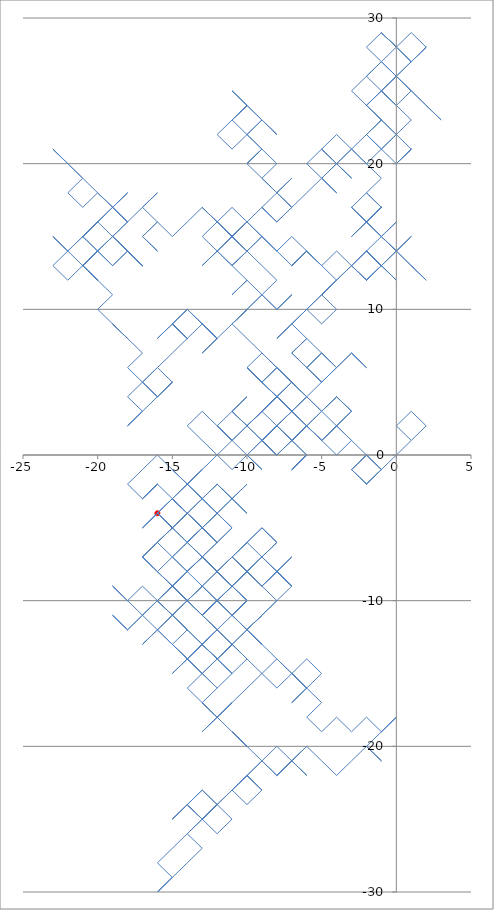
| Category | Series 0 |
|---|---|
| 1.0 | 1 |
| 0.0 | 2 |
| 1.0 | 3 |
| 2.0 | 2 |
| 1.0 | 1 |
| 0.0 | 0 |
| -1.0 | -1 |
| -2.0 | -2 |
| -1.0 | -1 |
| -2.0 | 0 |
| -1.0 | -1 |
| -2.0 | -2 |
| -3.0 | -1 |
| -2.0 | 0 |
| -3.0 | -1 |
| -2.0 | -2 |
| -3.0 | -1 |
| -2.0 | 0 |
| -3.0 | 1 |
| -4.0 | 2 |
| -5.0 | 1 |
| -4.0 | 2 |
| -3.0 | 3 |
| -4.0 | 4 |
| -3.0 | 3 |
| -4.0 | 2 |
| -5.0 | 3 |
| -4.0 | 4 |
| -5.0 | 3 |
| -6.0 | 2 |
| -7.0 | 3 |
| -8.0 | 4 |
| -9.0 | 3 |
| -10.0 | 2 |
| -9.0 | 3 |
| -8.0 | 4 |
| -9.0 | 5 |
| -8.0 | 4 |
| -9.0 | 3 |
| -8.0 | 2 |
| -9.0 | 1 |
| -8.0 | 0 |
| -7.0 | 1 |
| -6.0 | 0 |
| -7.0 | -1 |
| -6.0 | 0 |
| -7.0 | -1 |
| -6.0 | 0 |
| -7.0 | 1 |
| -8.0 | 0 |
| -9.0 | 1 |
| -8.0 | 2 |
| -7.0 | 1 |
| -6.0 | 2 |
| -5.0 | 1 |
| -6.0 | 2 |
| -7.0 | 1 |
| -6.0 | 2 |
| -5.0 | 1 |
| -4.0 | 2 |
| -5.0 | 1 |
| -6.0 | 2 |
| -7.0 | 3 |
| -8.0 | 4 |
| -9.0 | 5 |
| -10.0 | 6 |
| -9.0 | 5 |
| -8.0 | 4 |
| -7.0 | 3 |
| -8.0 | 2 |
| -7.0 | 1 |
| -6.0 | 2 |
| -7.0 | 3 |
| -8.0 | 4 |
| -9.0 | 3 |
| -10.0 | 2 |
| -9.0 | 3 |
| -8.0 | 4 |
| -7.0 | 3 |
| -8.0 | 4 |
| -7.0 | 3 |
| -8.0 | 2 |
| -7.0 | 1 |
| -8.0 | 2 |
| -9.0 | 1 |
| -8.0 | 0 |
| -9.0 | 1 |
| -10.0 | 0 |
| -9.0 | -1 |
| -10.0 | 0 |
| -11.0 | 1 |
| -12.0 | 2 |
| -11.0 | 1 |
| -12.0 | 2 |
| -13.0 | 3 |
| -14.0 | 2 |
| -13.0 | 1 |
| -12.0 | 0 |
| -11.0 | 1 |
| -10.0 | 2 |
| -11.0 | 3 |
| -10.0 | 2 |
| -11.0 | 3 |
| -10.0 | 4 |
| -11.0 | 3 |
| -12.0 | 2 |
| -11.0 | 1 |
| -10.0 | 2 |
| -9.0 | 1 |
| -8.0 | 0 |
| -9.0 | 1 |
| -10.0 | 2 |
| -9.0 | 3 |
| -8.0 | 4 |
| -7.0 | 3 |
| -6.0 | 4 |
| -7.0 | 5 |
| -8.0 | 6 |
| -9.0 | 5 |
| -8.0 | 4 |
| -7.0 | 5 |
| -8.0 | 6 |
| -9.0 | 5 |
| -10.0 | 6 |
| -9.0 | 5 |
| -10.0 | 6 |
| -9.0 | 7 |
| -8.0 | 6 |
| -7.0 | 5 |
| -8.0 | 4 |
| -7.0 | 3 |
| -8.0 | 2 |
| -9.0 | 1 |
| -8.0 | 2 |
| -7.0 | 3 |
| -6.0 | 4 |
| -7.0 | 5 |
| -6.0 | 4 |
| -7.0 | 3 |
| -6.0 | 2 |
| -7.0 | 1 |
| -6.0 | 2 |
| -5.0 | 3 |
| -6.0 | 4 |
| -7.0 | 5 |
| -8.0 | 6 |
| -9.0 | 5 |
| -8.0 | 4 |
| -7.0 | 5 |
| -8.0 | 6 |
| -9.0 | 7 |
| -10.0 | 8 |
| -11.0 | 9 |
| -10.0 | 10 |
| -11.0 | 9 |
| -10.0 | 10 |
| -11.0 | 9 |
| -10.0 | 10 |
| -9.0 | 11 |
| -8.0 | 12 |
| -9.0 | 13 |
| -10.0 | 14 |
| -9.0 | 15 |
| -10.0 | 16 |
| -11.0 | 17 |
| -12.0 | 16 |
| -11.0 | 15 |
| -12.0 | 16 |
| -13.0 | 17 |
| -14.0 | 16 |
| -15.0 | 15 |
| -16.0 | 16 |
| -17.0 | 15 |
| -16.0 | 14 |
| -17.0 | 15 |
| -16.0 | 16 |
| -17.0 | 17 |
| -16.0 | 18 |
| -17.0 | 17 |
| -18.0 | 16 |
| -19.0 | 17 |
| -20.0 | 18 |
| -21.0 | 17 |
| -22.0 | 18 |
| -21.0 | 19 |
| -22.0 | 20 |
| -23.0 | 21 |
| -22.0 | 20 |
| -21.0 | 19 |
| -20.0 | 18 |
| -19.0 | 17 |
| -20.0 | 16 |
| -21.0 | 15 |
| -20.0 | 14 |
| -21.0 | 13 |
| -20.0 | 14 |
| -21.0 | 13 |
| -20.0 | 12 |
| -21.0 | 13 |
| -20.0 | 12 |
| -21.0 | 13 |
| -20.0 | 14 |
| -19.0 | 15 |
| -18.0 | 16 |
| -19.0 | 17 |
| -18.0 | 16 |
| -19.0 | 15 |
| -18.0 | 14 |
| -19.0 | 15 |
| -18.0 | 14 |
| -17.0 | 13 |
| -18.0 | 14 |
| -19.0 | 13 |
| -20.0 | 14 |
| -21.0 | 15 |
| -20.0 | 16 |
| -19.0 | 17 |
| -18.0 | 18 |
| -19.0 | 17 |
| -20.0 | 18 |
| -19.0 | 17 |
| -20.0 | 16 |
| -21.0 | 15 |
| -20.0 | 16 |
| -21.0 | 15 |
| -20.0 | 16 |
| -19.0 | 15 |
| -18.0 | 14 |
| -17.0 | 13 |
| -18.0 | 14 |
| -17.0 | 13 |
| -18.0 | 14 |
| -19.0 | 15 |
| -18.0 | 14 |
| -19.0 | 13 |
| -20.0 | 14 |
| -19.0 | 15 |
| -20.0 | 14 |
| -21.0 | 13 |
| -22.0 | 12 |
| -23.0 | 13 |
| -22.0 | 14 |
| -23.0 | 15 |
| -22.0 | 14 |
| -21.0 | 15 |
| -20.0 | 16 |
| -21.0 | 15 |
| -22.0 | 14 |
| -21.0 | 13 |
| -20.0 | 12 |
| -19.0 | 11 |
| -20.0 | 10 |
| -19.0 | 9 |
| -18.0 | 8 |
| -19.0 | 9 |
| -18.0 | 8 |
| -17.0 | 7 |
| -18.0 | 6 |
| -17.0 | 5 |
| -18.0 | 4 |
| -17.0 | 3 |
| -18.0 | 2 |
| -17.0 | 3 |
| -16.0 | 4 |
| -15.0 | 5 |
| -16.0 | 4 |
| -15.0 | 5 |
| -16.0 | 6 |
| -17.0 | 5 |
| -16.0 | 4 |
| -17.0 | 5 |
| -16.0 | 6 |
| -15.0 | 7 |
| -14.0 | 8 |
| -15.0 | 9 |
| -14.0 | 8 |
| -15.0 | 9 |
| -16.0 | 8 |
| -15.0 | 9 |
| -14.0 | 10 |
| -15.0 | 9 |
| -14.0 | 8 |
| -13.0 | 9 |
| -14.0 | 10 |
| -13.0 | 9 |
| -12.0 | 8 |
| -13.0 | 9 |
| -12.0 | 8 |
| -13.0 | 7 |
| -12.0 | 8 |
| -11.0 | 9 |
| -10.0 | 10 |
| -9.0 | 11 |
| -8.0 | 10 |
| -7.0 | 11 |
| -8.0 | 10 |
| -9.0 | 11 |
| -10.0 | 12 |
| -11.0 | 11 |
| -10.0 | 12 |
| -11.0 | 13 |
| -10.0 | 14 |
| -11.0 | 13 |
| -12.0 | 14 |
| -13.0 | 13 |
| -12.0 | 14 |
| -11.0 | 15 |
| -10.0 | 16 |
| -11.0 | 15 |
| -12.0 | 16 |
| -13.0 | 17 |
| -12.0 | 16 |
| -11.0 | 15 |
| -12.0 | 14 |
| -11.0 | 15 |
| -10.0 | 16 |
| -11.0 | 15 |
| -12.0 | 16 |
| -13.0 | 15 |
| -12.0 | 14 |
| -11.0 | 13 |
| -10.0 | 14 |
| -11.0 | 15 |
| -10.0 | 14 |
| -11.0 | 15 |
| -10.0 | 14 |
| -9.0 | 15 |
| -10.0 | 16 |
| -9.0 | 17 |
| -8.0 | 18 |
| -7.0 | 17 |
| -8.0 | 16 |
| -9.0 | 17 |
| -8.0 | 16 |
| -7.0 | 17 |
| -8.0 | 18 |
| -9.0 | 19 |
| -8.0 | 20 |
| -9.0 | 21 |
| -10.0 | 22 |
| -9.0 | 23 |
| -10.0 | 24 |
| -11.0 | 23 |
| -10.0 | 24 |
| -11.0 | 23 |
| -10.0 | 22 |
| -11.0 | 21 |
| -12.0 | 22 |
| -11.0 | 23 |
| -10.0 | 24 |
| -11.0 | 25 |
| -10.0 | 24 |
| -9.0 | 23 |
| -8.0 | 22 |
| -9.0 | 23 |
| -10.0 | 22 |
| -9.0 | 21 |
| -10.0 | 20 |
| -9.0 | 21 |
| -10.0 | 20 |
| -9.0 | 19 |
| -8.0 | 18 |
| -7.0 | 19 |
| -8.0 | 18 |
| -7.0 | 17 |
| -6.0 | 18 |
| -5.0 | 19 |
| -4.0 | 20 |
| -3.0 | 21 |
| -2.0 | 22 |
| -1.0 | 23 |
| 0.0 | 22 |
| 1.0 | 21 |
| 0.0 | 20 |
| 1.0 | 21 |
| 0.0 | 20 |
| -1.0 | 21 |
| 0.0 | 22 |
| 1.0 | 23 |
| 0.0 | 24 |
| -1.0 | 25 |
| 0.0 | 26 |
| 1.0 | 25 |
| 0.0 | 24 |
| -1.0 | 25 |
| 0.0 | 26 |
| 1.0 | 25 |
| 2.0 | 24 |
| 3.0 | 23 |
| 2.0 | 24 |
| 1.0 | 25 |
| 0.0 | 26 |
| -1.0 | 27 |
| -2.0 | 28 |
| -1.0 | 29 |
| 0.0 | 28 |
| -1.0 | 29 |
| 0.0 | 28 |
| -1.0 | 29 |
| 0.0 | 28 |
| 1.0 | 27 |
| 2.0 | 28 |
| 1.0 | 29 |
| 0.0 | 28 |
| 1.0 | 27 |
| 0.0 | 26 |
| -1.0 | 25 |
| -2.0 | 24 |
| -1.0 | 25 |
| 0.0 | 24 |
| -1.0 | 25 |
| -2.0 | 26 |
| -1.0 | 27 |
| 0.0 | 28 |
| 1.0 | 27 |
| 2.0 | 28 |
| 1.0 | 27 |
| 0.0 | 26 |
| -1.0 | 27 |
| -2.0 | 26 |
| -3.0 | 25 |
| -2.0 | 24 |
| -1.0 | 23 |
| -2.0 | 22 |
| -1.0 | 21 |
| 0.0 | 22 |
| -1.0 | 23 |
| -2.0 | 24 |
| -1.0 | 23 |
| -2.0 | 22 |
| -1.0 | 21 |
| -2.0 | 20 |
| -3.0 | 21 |
| -4.0 | 20 |
| -5.0 | 21 |
| -4.0 | 20 |
| -3.0 | 19 |
| -4.0 | 20 |
| -5.0 | 19 |
| -4.0 | 18 |
| -5.0 | 19 |
| -6.0 | 20 |
| -5.0 | 21 |
| -4.0 | 22 |
| -3.0 | 21 |
| -2.0 | 20 |
| -1.0 | 19 |
| -2.0 | 18 |
| -1.0 | 17 |
| -2.0 | 16 |
| -3.0 | 15 |
| -2.0 | 16 |
| -3.0 | 17 |
| -2.0 | 16 |
| -1.0 | 17 |
| -2.0 | 18 |
| -3.0 | 17 |
| -2.0 | 16 |
| -1.0 | 15 |
| -2.0 | 16 |
| -1.0 | 17 |
| -2.0 | 16 |
| -1.0 | 17 |
| -2.0 | 16 |
| -1.0 | 15 |
| -2.0 | 14 |
| -3.0 | 13 |
| -4.0 | 12 |
| -3.0 | 13 |
| -2.0 | 12 |
| -1.0 | 13 |
| 0.0 | 14 |
| 1.0 | 13 |
| 2.0 | 12 |
| 1.0 | 13 |
| 0.0 | 14 |
| -1.0 | 15 |
| 0.0 | 14 |
| -1.0 | 15 |
| 0.0 | 16 |
| -1.0 | 15 |
| 0.0 | 14 |
| 1.0 | 15 |
| 0.0 | 14 |
| -1.0 | 13 |
| -2.0 | 14 |
| -1.0 | 13 |
| -2.0 | 14 |
| -1.0 | 13 |
| -2.0 | 12 |
| -1.0 | 13 |
| 0.0 | 12 |
| -1.0 | 13 |
| -2.0 | 12 |
| -3.0 | 13 |
| -2.0 | 12 |
| -3.0 | 13 |
| -2.0 | 14 |
| -1.0 | 13 |
| -2.0 | 14 |
| -3.0 | 13 |
| -4.0 | 14 |
| -5.0 | 13 |
| -6.0 | 14 |
| -5.0 | 13 |
| -6.0 | 14 |
| -7.0 | 15 |
| -8.0 | 14 |
| -9.0 | 15 |
| -8.0 | 14 |
| -7.0 | 13 |
| -6.0 | 14 |
| -7.0 | 13 |
| -6.0 | 14 |
| -5.0 | 13 |
| -4.0 | 12 |
| -5.0 | 11 |
| -4.0 | 12 |
| -5.0 | 11 |
| -6.0 | 10 |
| -7.0 | 9 |
| -8.0 | 8 |
| -7.0 | 9 |
| -6.0 | 10 |
| -5.0 | 11 |
| -4.0 | 10 |
| -5.0 | 9 |
| -6.0 | 10 |
| -7.0 | 9 |
| -6.0 | 8 |
| -5.0 | 7 |
| -6.0 | 6 |
| -7.0 | 7 |
| -6.0 | 8 |
| -7.0 | 7 |
| -6.0 | 6 |
| -5.0 | 7 |
| -4.0 | 6 |
| -5.0 | 7 |
| -6.0 | 6 |
| -5.0 | 5 |
| -4.0 | 6 |
| -3.0 | 7 |
| -2.0 | 6 |
| -3.0 | 7 |
| -4.0 | 6 |
| -5.0 | 5 |
| -6.0 | 6 |
| -5.0 | 5 |
| -6.0 | 4 |
| -5.0 | 3 |
| -4.0 | 4 |
| -3.0 | 3 |
| -4.0 | 2 |
| -3.0 | 1 |
| -4.0 | 0 |
| -5.0 | 1 |
| -6.0 | 2 |
| -7.0 | 1 |
| -6.0 | 2 |
| -7.0 | 1 |
| -8.0 | 0 |
| -9.0 | 1 |
| -10.0 | 0 |
| -11.0 | -1 |
| -12.0 | 0 |
| -13.0 | -1 |
| -14.0 | -2 |
| -15.0 | -3 |
| -16.0 | -4 |
| -15.0 | -3 |
| -14.0 | -4 |
| -15.0 | -5 |
| -14.0 | -4 |
| -15.0 | -3 |
| -14.0 | -4 |
| -15.0 | -3 |
| -16.0 | -2 |
| -17.0 | -3 |
| -16.0 | -2 |
| -17.0 | -3 |
| -18.0 | -2 |
| -17.0 | -1 |
| -16.0 | 0 |
| -15.0 | -1 |
| -14.0 | -2 |
| -13.0 | -3 |
| -12.0 | -4 |
| -11.0 | -3 |
| -10.0 | -4 |
| -11.0 | -3 |
| -12.0 | -2 |
| -11.0 | -3 |
| -10.0 | -2 |
| -11.0 | -3 |
| -12.0 | -4 |
| -11.0 | -5 |
| -12.0 | -6 |
| -13.0 | -5 |
| -14.0 | -6 |
| -13.0 | -5 |
| -14.0 | -4 |
| -13.0 | -5 |
| -12.0 | -6 |
| -13.0 | -7 |
| -14.0 | -8 |
| -15.0 | -9 |
| -14.0 | -10 |
| -13.0 | -11 |
| -14.0 | -10 |
| -13.0 | -9 |
| -14.0 | -10 |
| -15.0 | -11 |
| -16.0 | -12 |
| -17.0 | -13 |
| -16.0 | -12 |
| -15.0 | -11 |
| -14.0 | -10 |
| -13.0 | -9 |
| -14.0 | -8 |
| -15.0 | -7 |
| -14.0 | -6 |
| -13.0 | -7 |
| -12.0 | -8 |
| -11.0 | -7 |
| -10.0 | -8 |
| -9.0 | -7 |
| -8.0 | -8 |
| -7.0 | -9 |
| -8.0 | -8 |
| -9.0 | -9 |
| -8.0 | -8 |
| -7.0 | -9 |
| -8.0 | -10 |
| -9.0 | -11 |
| -10.0 | -12 |
| -9.0 | -13 |
| -8.0 | -14 |
| -7.0 | -15 |
| -6.0 | -14 |
| -5.0 | -15 |
| -6.0 | -16 |
| -7.0 | -15 |
| -8.0 | -14 |
| -9.0 | -15 |
| -10.0 | -14 |
| -11.0 | -13 |
| -12.0 | -14 |
| -11.0 | -13 |
| -12.0 | -14 |
| -13.0 | -13 |
| -12.0 | -12 |
| -13.0 | -13 |
| -14.0 | -14 |
| -13.0 | -13 |
| -14.0 | -12 |
| -15.0 | -11 |
| -14.0 | -12 |
| -15.0 | -11 |
| -16.0 | -12 |
| -15.0 | -13 |
| -14.0 | -12 |
| -13.0 | -13 |
| -12.0 | -14 |
| -13.0 | -15 |
| -14.0 | -14 |
| -15.0 | -15 |
| -14.0 | -14 |
| -13.0 | -13 |
| -12.0 | -14 |
| -13.0 | -13 |
| -12.0 | -14 |
| -13.0 | -15 |
| -12.0 | -16 |
| -13.0 | -17 |
| -12.0 | -18 |
| -11.0 | -17 |
| -12.0 | -18 |
| -13.0 | -17 |
| -12.0 | -18 |
| -11.0 | -17 |
| -10.0 | -16 |
| -9.0 | -15 |
| -8.0 | -16 |
| -7.0 | -15 |
| -6.0 | -16 |
| -7.0 | -17 |
| -6.0 | -16 |
| -7.0 | -15 |
| -6.0 | -16 |
| -5.0 | -17 |
| -6.0 | -18 |
| -5.0 | -19 |
| -4.0 | -18 |
| -3.0 | -19 |
| -2.0 | -18 |
| -1.0 | -19 |
| 0.0 | -18 |
| -1.0 | -19 |
| -2.0 | -20 |
| -1.0 | -21 |
| -2.0 | -20 |
| -3.0 | -21 |
| -4.0 | -22 |
| -5.0 | -21 |
| -6.0 | -20 |
| -7.0 | -21 |
| -8.0 | -20 |
| -9.0 | -21 |
| -10.0 | -22 |
| -9.0 | -23 |
| -10.0 | -24 |
| -11.0 | -23 |
| -10.0 | -22 |
| -11.0 | -23 |
| -12.0 | -24 |
| -13.0 | -25 |
| -12.0 | -26 |
| -11.0 | -25 |
| -12.0 | -24 |
| -13.0 | -23 |
| -14.0 | -24 |
| -15.0 | -25 |
| -14.0 | -24 |
| -13.0 | -25 |
| -14.0 | -26 |
| -13.0 | -27 |
| -14.0 | -28 |
| -15.0 | -29 |
| -16.0 | -30 |
| -15.0 | -29 |
| -16.0 | -28 |
| -15.0 | -27 |
| -14.0 | -26 |
| -13.0 | -25 |
| -12.0 | -24 |
| -13.0 | -25 |
| -14.0 | -24 |
| -13.0 | -25 |
| -12.0 | -24 |
| -13.0 | -25 |
| -14.0 | -24 |
| -13.0 | -23 |
| -12.0 | -24 |
| -11.0 | -23 |
| -10.0 | -22 |
| -9.0 | -23 |
| -10.0 | -22 |
| -9.0 | -21 |
| -8.0 | -22 |
| -7.0 | -21 |
| -6.0 | -22 |
| -7.0 | -21 |
| -8.0 | -22 |
| -7.0 | -21 |
| -6.0 | -20 |
| -7.0 | -21 |
| -8.0 | -22 |
| -9.0 | -21 |
| -10.0 | -20 |
| -11.0 | -19 |
| -10.0 | -20 |
| -11.0 | -19 |
| -12.0 | -18 |
| -13.0 | -19 |
| -12.0 | -18 |
| -13.0 | -17 |
| -14.0 | -16 |
| -13.0 | -15 |
| -14.0 | -14 |
| -13.0 | -15 |
| -12.0 | -16 |
| -11.0 | -15 |
| -10.0 | -14 |
| -11.0 | -13 |
| -12.0 | -14 |
| -13.0 | -13 |
| -12.0 | -14 |
| -11.0 | -15 |
| -12.0 | -14 |
| -11.0 | -13 |
| -12.0 | -12 |
| -13.0 | -11 |
| -12.0 | -10 |
| -11.0 | -9 |
| -10.0 | -10 |
| -11.0 | -11 |
| -10.0 | -10 |
| -11.0 | -9 |
| -10.0 | -10 |
| -11.0 | -9 |
| -12.0 | -8 |
| -13.0 | -7 |
| -14.0 | -6 |
| -13.0 | -5 |
| -14.0 | -6 |
| -15.0 | -5 |
| -16.0 | -6 |
| -15.0 | -5 |
| -16.0 | -6 |
| -17.0 | -7 |
| -16.0 | -6 |
| -15.0 | -7 |
| -14.0 | -8 |
| -13.0 | -7 |
| -14.0 | -8 |
| -15.0 | -9 |
| -16.0 | -10 |
| -15.0 | -9 |
| -14.0 | -8 |
| -13.0 | -7 |
| -12.0 | -8 |
| -11.0 | -9 |
| -12.0 | -8 |
| -11.0 | -9 |
| -12.0 | -10 |
| -13.0 | -11 |
| -12.0 | -12 |
| -11.0 | -13 |
| -12.0 | -14 |
| -11.0 | -13 |
| -10.0 | -12 |
| -9.0 | -11 |
| -10.0 | -12 |
| -9.0 | -11 |
| -10.0 | -12 |
| -11.0 | -11 |
| -12.0 | -10 |
| -13.0 | -11 |
| -12.0 | -10 |
| -11.0 | -9 |
| -12.0 | -10 |
| -11.0 | -11 |
| -10.0 | -12 |
| -9.0 | -13 |
| -10.0 | -12 |
| -11.0 | -11 |
| -12.0 | -10 |
| -13.0 | -11 |
| -12.0 | -12 |
| -13.0 | -13 |
| -14.0 | -14 |
| -15.0 | -13 |
| -14.0 | -14 |
| -15.0 | -13 |
| -16.0 | -12 |
| -17.0 | -11 |
| -18.0 | -12 |
| -19.0 | -11 |
| -18.0 | -12 |
| -17.0 | -11 |
| -18.0 | -10 |
| -19.0 | -9 |
| -18.0 | -10 |
| -17.0 | -9 |
| -16.0 | -10 |
| -17.0 | -11 |
| -16.0 | -10 |
| -15.0 | -11 |
| -16.0 | -10 |
| -15.0 | -11 |
| -14.0 | -10 |
| -15.0 | -9 |
| -16.0 | -8 |
| -15.0 | -9 |
| -14.0 | -10 |
| -15.0 | -9 |
| -14.0 | -10 |
| -15.0 | -11 |
| -16.0 | -10 |
| -15.0 | -9 |
| -16.0 | -8 |
| -17.0 | -7 |
| -16.0 | -8 |
| -15.0 | -9 |
| -14.0 | -10 |
| -13.0 | -9 |
| -14.0 | -10 |
| -15.0 | -9 |
| -14.0 | -8 |
| -13.0 | -7 |
| -12.0 | -6 |
| -11.0 | -5 |
| -12.0 | -4 |
| -13.0 | -3 |
| -14.0 | -2 |
| -13.0 | -3 |
| -14.0 | -4 |
| -15.0 | -5 |
| -16.0 | -4 |
| -15.0 | -5 |
| -16.0 | -4 |
| -15.0 | -3 |
| -14.0 | -2 |
| -13.0 | -1 |
| -14.0 | -2 |
| -15.0 | -1 |
| -14.0 | -2 |
| -15.0 | -3 |
| -14.0 | -4 |
| -13.0 | -5 |
| -12.0 | -4 |
| -13.0 | -5 |
| -14.0 | -4 |
| -13.0 | -5 |
| -12.0 | -6 |
| -13.0 | -5 |
| -14.0 | -4 |
| -15.0 | -5 |
| -16.0 | -4 |
| -17.0 | -5 |
| -16.0 | -4 |
| -15.0 | -5 |
| -16.0 | -6 |
| -17.0 | -7 |
| -16.0 | -8 |
| -15.0 | -7 |
| -14.0 | -6 |
| -13.0 | -7 |
| -14.0 | -8 |
| -13.0 | -7 |
| -12.0 | -8 |
| -11.0 | -9 |
| -12.0 | -10 |
| -11.0 | -11 |
| -10.0 | -10 |
| -11.0 | -11 |
| -12.0 | -12 |
| -13.0 | -11 |
| -12.0 | -10 |
| -13.0 | -11 |
| -12.0 | -12 |
| -11.0 | -13 |
| -10.0 | -12 |
| -9.0 | -11 |
| -8.0 | -10 |
| -9.0 | -9 |
| -8.0 | -8 |
| -7.0 | -7 |
| -8.0 | -8 |
| -9.0 | -9 |
| -10.0 | -8 |
| -9.0 | -9 |
| -10.0 | -8 |
| -11.0 | -7 |
| -12.0 | -8 |
| -11.0 | -9 |
| -10.0 | -8 |
| -9.0 | -7 |
| -8.0 | -8 |
| -7.0 | -9 |
| -8.0 | -8 |
| -9.0 | -7 |
| -8.0 | -6 |
| -9.0 | -7 |
| -10.0 | -8 |
| -11.0 | -7 |
| -10.0 | -8 |
| -9.0 | -7 |
| -10.0 | -6 |
| -9.0 | -5 |
| -8.0 | -6 |
| -9.0 | -5 |
| -10.0 | -6 |
| -11.0 | -7 |
| -12.0 | -8 |
| -13.0 | -7 |
| -12.0 | -8 |
| -11.0 | -9 |
| -10.0 | -8 |
| -11.0 | -9 |
| -12.0 | -8 |
| -11.0 | -9 |
| -12.0 | -8 |
| -13.0 | -9 |
| -12.0 | -10 |
| -13.0 | -9 |
| -12.0 | -8 |
| -11.0 | -7 |
| -10.0 | -6 |
| -11.0 | -7 |
| -10.0 | -8 |
| -11.0 | -9 |
| -12.0 | -8 |
| -13.0 | -7 |
| -12.0 | -8 |
| -13.0 | -7 |
| -14.0 | -6 |
| -13.0 | -5 |
| -14.0 | -4 |
| -13.0 | -3 |
| -12.0 | -2 |
| -13.0 | -3 |
| -12.0 | -4 |
| -13.0 | -5 |
| -14.0 | -4 |
| -13.0 | -5 |
| -14.0 | -6 |
| -15.0 | -5 |
| -16.0 | -4 |